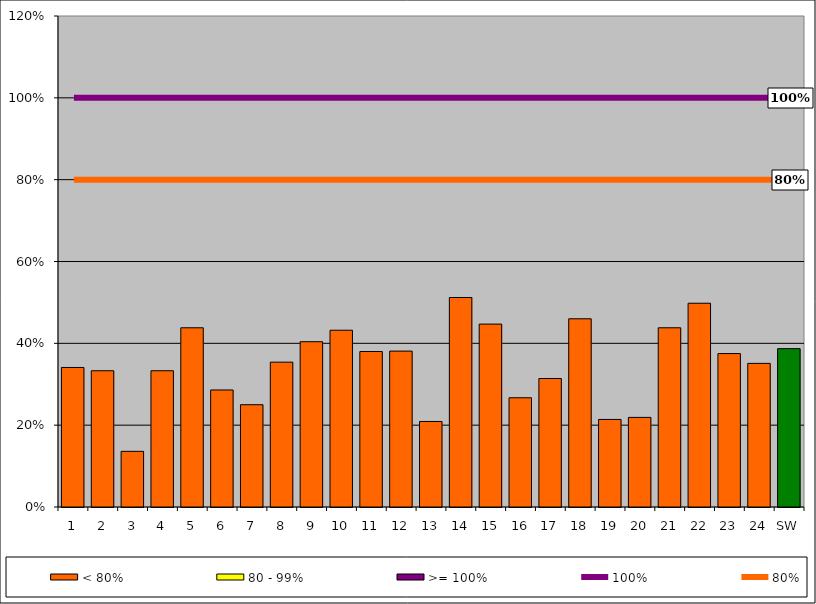
| Category | < 80% | 80 - 99% | >= 100% |
|---|---|---|---|
| 1 | 0.341 | 0 | 0 |
| 2 | 0.333 | 0 | 0 |
| 3 | 0.136 | 0 | 0 |
| 4 | 0.333 | 0 | 0 |
| 5 | 0.438 | 0 | 0 |
| 6 | 0.286 | 0 | 0 |
| 7 | 0.25 | 0 | 0 |
| 8 | 0.354 | 0 | 0 |
| 9 | 0.404 | 0 | 0 |
| 10 | 0.432 | 0 | 0 |
| 11 | 0.38 | 0 | 0 |
| 12 | 0.381 | 0 | 0 |
| 13 | 0.209 | 0 | 0 |
| 14 | 0.512 | 0 | 0 |
| 15 | 0.447 | 0 | 0 |
| 16 | 0.267 | 0 | 0 |
| 17 | 0.314 | 0 | 0 |
| 18 | 0.46 | 0 | 0 |
| 19 | 0.214 | 0 | 0 |
| 20 | 0.219 | 0 | 0 |
| 21 | 0.438 | 0 | 0 |
| 22 | 0.498 | 0 | 0 |
| 23 | 0.375 | 0 | 0 |
| 24 | 0.351 | 0 | 0 |
| SW | 0.387 | 0 | 0 |